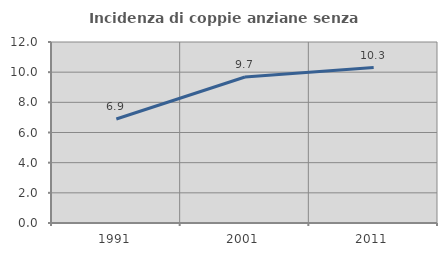
| Category | Incidenza di coppie anziane senza figli  |
|---|---|
| 1991.0 | 6.897 |
| 2001.0 | 9.677 |
| 2011.0 | 10.309 |